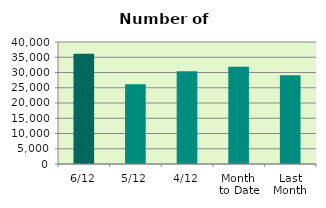
| Category | Series 0 |
|---|---|
| 6/12 | 36140 |
| 5/12 | 26122 |
| 4/12 | 30396 |
| Month 
to Date | 31909 |
| Last
Month | 29125.182 |